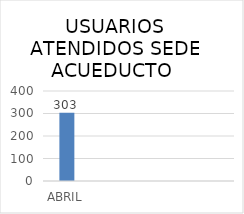
| Category | Series 0 |
|---|---|
| ABRIL | 303 |